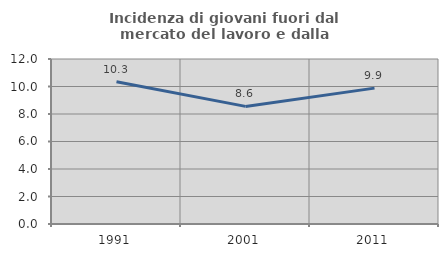
| Category | Incidenza di giovani fuori dal mercato del lavoro e dalla formazione  |
|---|---|
| 1991.0 | 10.345 |
| 2001.0 | 8.553 |
| 2011.0 | 9.881 |